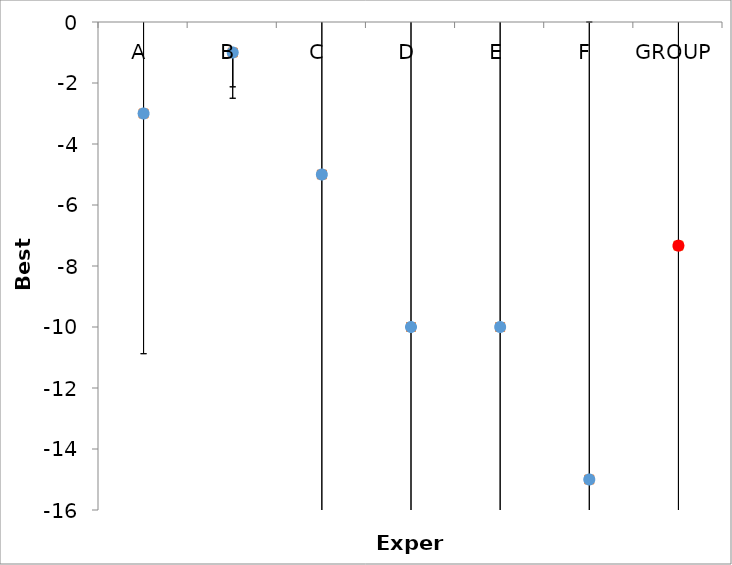
| Category | Series 1 | Series 0 |
|---|---|---|
| A | -3 | -3 |
| B | -1 | -1 |
| C | -5 | -5 |
| D | -10 | -10 |
| E | -10 | -10 |
| F | -15 | -15 |
| GROUP | -7.333 | -7.333 |